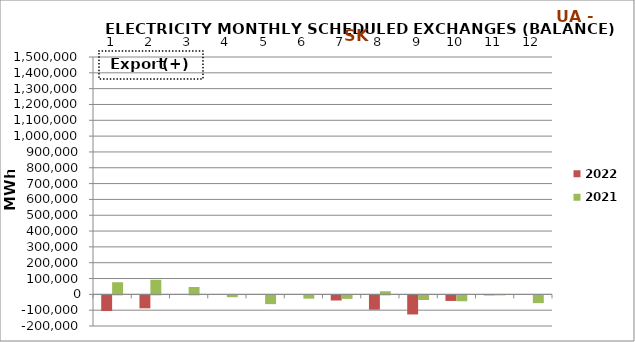
| Category | 2022 | 2021 |
|---|---|---|
| 0 | -99119 | 76598 |
| 1 | -81959 | 92160 |
| 2 | 0 | 46600 |
| 3 | 0 | -11643 |
| 4 | 0 | -55492 |
| 5 | 0 | -20932 |
| 6 | -32541 | -22162 |
| 7 | -90626 | 19617 |
| 8 | -120741 | -29379 |
| 9 | -35351 | -37268 |
| 10 | 127 | 1854 |
| 11 | 0 | -49247 |